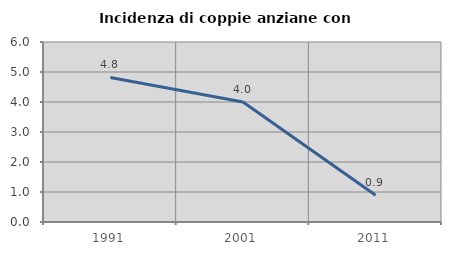
| Category | Incidenza di coppie anziane con figli |
|---|---|
| 1991.0 | 4.819 |
| 2001.0 | 4 |
| 2011.0 | 0.893 |